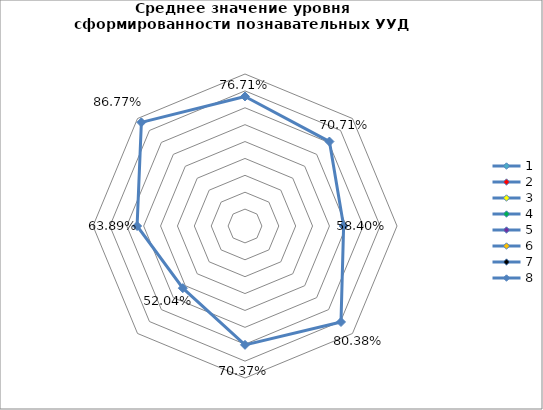
| Category | Series 0 |
|---|---|
| 0 | 0.767 |
| 1 | 0.707 |
| 2 | 0.584 |
| 3 | 0.804 |
| 4 | 0.704 |
| 5 | 0.52 |
| 6 | 0.639 |
| 7 | 0.868 |